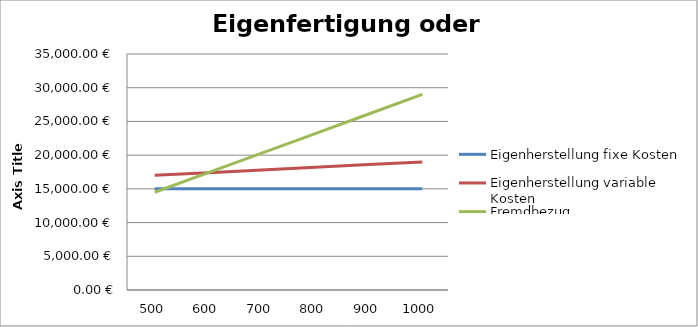
| Category | Eigenherstellung fixe Kosten | Eigenherstellung variable Kosten | Fremdbezug |
|---|---|---|---|
| 500.0 | 15000 | 17000 | 14500 |
| 600.0 | 15000 | 17400 | 17400 |
| 700.0 | 15000 | 17800 | 20300 |
| 800.0 | 15000 | 18200 | 23200 |
| 900.0 | 15000 | 18600 | 26100 |
| 1000.0 | 15000 | 19000 | 29000 |